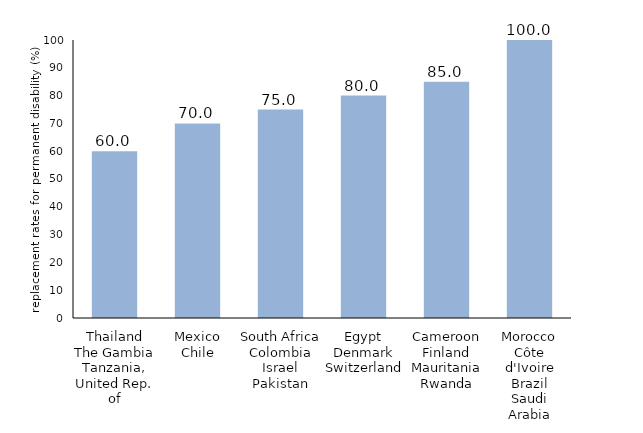
| Category | Series 0 |
|---|---|
| Thailand
The Gambia
Tanzania, United Rep. of | 60 |
| Mexico
Chile | 70 |
| South Africa
Colombia
Israel
Pakistan | 75 |
| Egypt
Denmark
Switzerland | 80 |
| Cameroon
Finland
Mauritania
Rwanda | 85 |
| Morocco
Côte d'Ivoire
Brazil
Saudi Arabia | 100 |